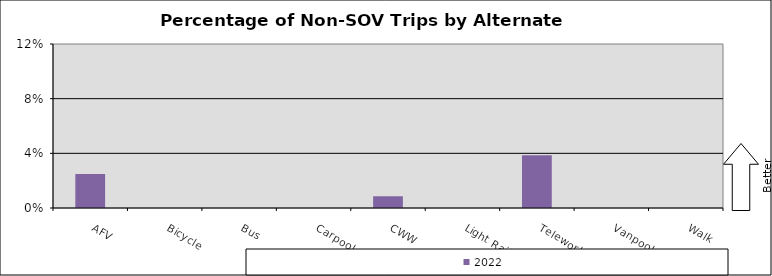
| Category | 2022 |
|---|---|
| AFV | 0.025 |
| Bicycle | 0 |
| Bus | 0 |
| Carpool | 0 |
| CWW | 0.009 |
| Light Rail | 0 |
| Telework | 0.039 |
| Vanpool | 0 |
| Walk | 0 |